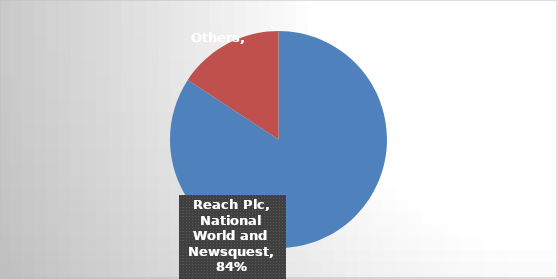
| Category | Series 0 |
|---|---|
| Reach Plc, National World and Newsquest | 0.842 |
| Others | 0.158 |